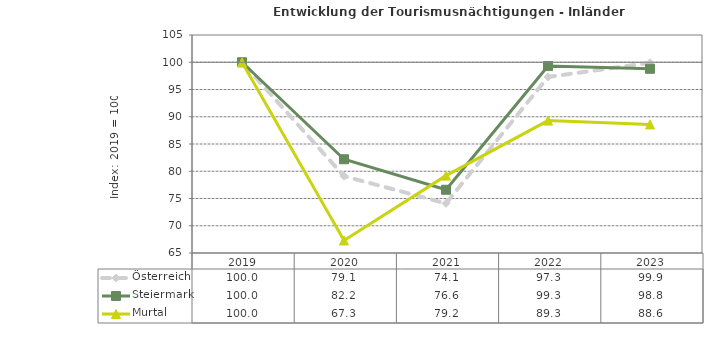
| Category | Österreich | Steiermark | Murtal |
|---|---|---|---|
| 2023.0 | 99.9 | 98.8 | 88.6 |
| 2022.0 | 97.3 | 99.3 | 89.3 |
| 2021.0 | 74.1 | 76.6 | 79.2 |
| 2020.0 | 79.1 | 82.2 | 67.3 |
| 2019.0 | 100 | 100 | 100 |